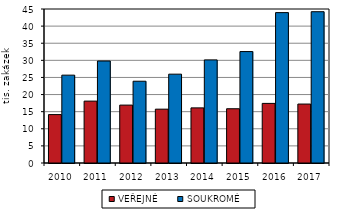
| Category | VEŘEJNÉ | SOUKROMÉ |
|---|---|---|
| 2010.0 | 14149 | 25670 |
| 2011.0 | 18084 | 29803 |
| 2012.0 | 16917 | 23894 |
| 2013.0 | 15729 | 25958 |
| 2014.0 | 16106 | 30127 |
| 2015.0 | 15856 | 32562 |
| 2016.0 | 17414 | 43944 |
| 2017.0 | 17223 | 44206 |